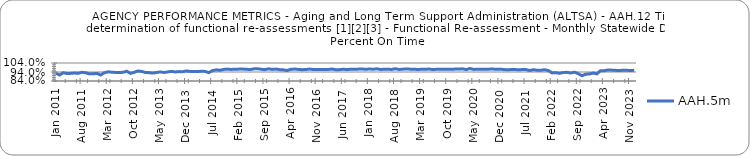
| Category | AAH.5m |
|---|---|
| 2011-01-01 | 0.926 |
| 2011-02-01 | 0.907 |
| 2011-03-01 | 0.932 |
| 2011-04-01 | 0.923 |
| 2011-05-01 | 0.925 |
| 2011-06-01 | 0.928 |
| 2011-07-01 | 0.925 |
| 2011-08-01 | 0.937 |
| 2011-09-01 | 0.931 |
| 2011-10-01 | 0.919 |
| 2011-11-01 | 0.92 |
| 2011-12-01 | 0.924 |
| 2012-01-01 | 0.907 |
| 2012-02-01 | 0.932 |
| 2012-03-01 | 0.942 |
| 2012-04-01 | 0.938 |
| 2012-05-01 | 0.935 |
| 2012-06-01 | 0.935 |
| 2012-07-01 | 0.937 |
| 2012-08-01 | 0.949 |
| 2012-09-01 | 0.924 |
| 2012-10-01 | 0.937 |
| 2012-11-01 | 0.951 |
| 2012-12-01 | 0.946 |
| 2013-01-01 | 0.935 |
| 2013-02-01 | 0.933 |
| 2013-03-01 | 0.928 |
| 2013-04-01 | 0.935 |
| 2013-05-01 | 0.941 |
| 2013-06-01 | 0.935 |
| 2013-07-01 | 0.941 |
| 2013-08-01 | 0.947 |
| 2013-09-01 | 0.941 |
| 2013-10-01 | 0.944 |
| 2013-11-01 | 0.944 |
| 2013-12-01 | 0.951 |
| 2014-01-01 | 0.947 |
| 2014-02-01 | 0.947 |
| 2014-03-01 | 0.945 |
| 2014-04-01 | 0.948 |
| 2014-05-01 | 0.947 |
| 2014-06-01 | 0.933 |
| 2014-07-01 | 0.956 |
| 2014-08-01 | 0.964 |
| 2014-09-01 | 0.959 |
| 2014-10-01 | 0.969 |
| 2014-11-01 | 0.972 |
| 2014-12-01 | 0.968 |
| 2015-01-01 | 0.971 |
| 2015-02-01 | 0.972 |
| 2015-03-01 | 0.972 |
| 2015-04-01 | 0.971 |
| 2015-05-01 | 0.967 |
| 2015-06-01 | 0.974 |
| 2015-07-01 | 0.977 |
| 2015-08-01 | 0.971 |
| 2015-09-01 | 0.966 |
| 2015-10-01 | 0.975 |
| 2015-11-01 | 0.969 |
| 2015-12-01 | 0.973 |
| 2016-01-01 | 0.966 |
| 2016-02-01 | 0.964 |
| 2016-03-01 | 0.957 |
| 2016-04-01 | 0.97 |
| 2016-05-01 | 0.973 |
| 2016-06-01 | 0.969 |
| 2016-07-01 | 0.966 |
| 2016-08-01 | 0.968 |
| 2016-09-01 | 0.973 |
| 2016-10-01 | 0.968 |
| 2016-11-01 | 0.968 |
| 2016-12-01 | 0.969 |
| 2017-01-01 | 0.969 |
| 2017-02-01 | 0.968 |
| 2017-03-01 | 0.973 |
| 2017-04-01 | 0.966 |
| 2017-05-01 | 0.966 |
| 2017-06-01 | 0.97 |
| 2017-07-01 | 0.968 |
| 2017-08-01 | 0.97 |
| 2017-09-01 | 0.97 |
| 2017-10-01 | 0.972 |
| 2017-11-01 | 0.974 |
| 2017-12-01 | 0.97 |
| 2018-01-01 | 0.973 |
| 2018-02-01 | 0.971 |
| 2018-03-01 | 0.975 |
| 2018-04-01 | 0.969 |
| 2018-05-01 | 0.97 |
| 2018-06-01 | 0.971 |
| 2018-07-01 | 0.968 |
| 2018-08-01 | 0.976 |
| 2018-09-01 | 0.968 |
| 2018-10-01 | 0.971 |
| 2018-11-01 | 0.975 |
| 2018-12-01 | 0.971 |
| 2019-01-01 | 0.971 |
| 2019-02-01 | 0.968 |
| 2019-03-01 | 0.97 |
| 2019-04-01 | 0.97 |
| 2019-05-01 | 0.973 |
| 2019-06-01 | 0.967 |
| 2019-07-01 | 0.97 |
| 2019-08-01 | 0.971 |
| 2019-09-01 | 0.97 |
| 2019-10-01 | 0.97 |
| 2019-11-01 | 0.969 |
| 2019-12-01 | 0.972 |
| 2020-01-01 | 0.974 |
| 2020-02-01 | 0.975 |
| 2020-03-01 | 0.967 |
| 2020-04-01 | 0.979 |
| 2020-05-01 | 0.969 |
| 2020-06-01 | 0.97 |
| 2020-07-01 | 0.971 |
| 2020-08-01 | 0.971 |
| 2020-09-01 | 0.971 |
| 2020-10-01 | 0.974 |
| 2020-11-01 | 0.969 |
| 2020-12-01 | 0.972 |
| 2021-01-01 | 0.968 |
| 2021-02-01 | 0.964 |
| 2021-03-01 | 0.968 |
| 2021-04-01 | 0.968 |
| 2021-05-01 | 0.964 |
| 2021-06-01 | 0.967 |
| 2021-07-01 | 0.967 |
| 2021-08-01 | 0.957 |
| 2021-09-01 | 0.966 |
| 2021-10-01 | 0.959 |
| 2021-11-01 | 0.959 |
| 2021-12-01 | 0.965 |
| 2022-01-01 | 0.956 |
| 2022-02-01 | 0.93 |
| 2022-03-01 | 0.932 |
| 2022-04-01 | 0.926 |
| 2022-05-01 | 0.935 |
| 2022-06-01 | 0.936 |
| 2022-07-01 | 0.928 |
| 2022-08-01 | 0.938 |
| 2022-09-01 | 0.922 |
| 2022-10-01 | 0.898 |
| 2022-11-01 | 0.915 |
| 2022-12-01 | 0.918 |
| 2023-01-01 | 0.928 |
| 2023-02-01 | 0.919 |
| 2023-03-01 | 0.955 |
| 2023-04-01 | 0.955 |
| 2023-05-01 | 0.963 |
| 2023-06-01 | 0.961 |
| 2023-07-01 | 0.958 |
| 2023-08-01 | 0.956 |
| 2023-09-01 | 0.96 |
| 2023-10-01 | 0.958 |
| 2023-11-01 | 0.958 |
| 2023-12-01 | 0.958 |